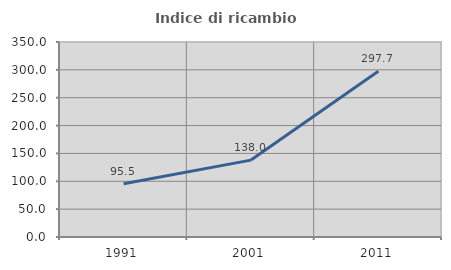
| Category | Indice di ricambio occupazionale  |
|---|---|
| 1991.0 | 95.474 |
| 2001.0 | 138.022 |
| 2011.0 | 297.655 |